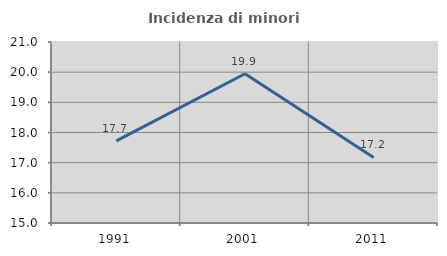
| Category | Incidenza di minori stranieri |
|---|---|
| 1991.0 | 17.722 |
| 2001.0 | 19.947 |
| 2011.0 | 17.175 |